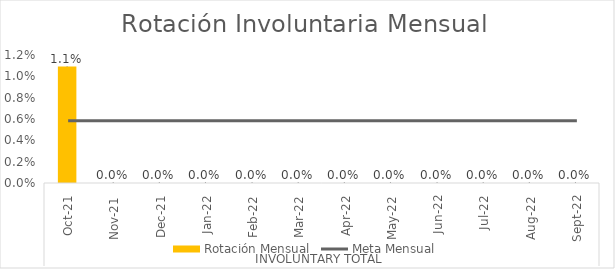
| Category | Series 4 | Series 5 | Rotación Mensual | Series 6 |
|---|---|---|---|---|
| 0 |  |  | 0.011 |  |
| 1 |  |  | 0 |  |
| 2 |  |  | 0 |  |
| 3 |  |  | 0 |  |
| 4 |  |  | 0 |  |
| 5 |  |  | 0 |  |
| 6 |  |  | 0 |  |
| 7 |  |  | 0 |  |
| 8 |  |  | 0 |  |
| 9 |  |  | 0 |  |
| 10 |  |  | 0 |  |
| 11 |  |  | 0 |  |